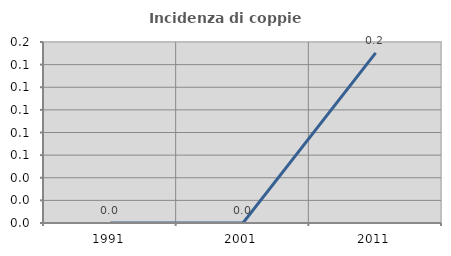
| Category | Incidenza di coppie miste |
|---|---|
| 1991.0 | 0 |
| 2001.0 | 0 |
| 2011.0 | 0.15 |